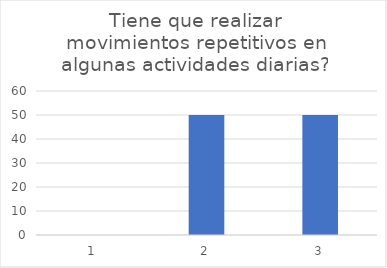
| Category | Tiene que realizar movimientos repetitivos en algunas actividades diarias? |
|---|---|
| 0 | 0 |
| 1 | 50 |
| 2 | 50 |